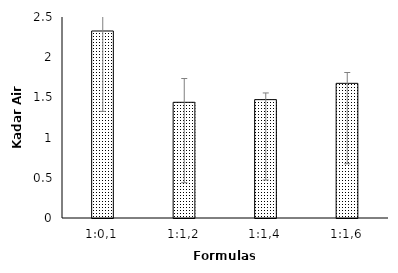
| Category | Kadar Air (%) |
|---|---|
| 1:0,1 | 2.326 |
| 1:1,2 | 1.439 |
| 1:1,4 | 1.472 |
| 1:1,6 | 1.675 |